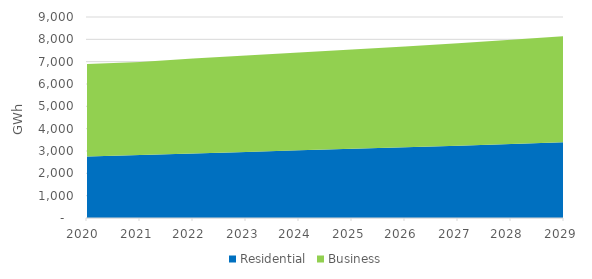
| Category | Residential | Business |
|---|---|---|
| 2020.0 | 2752.511 | 4138.821 |
| 2021.0 | 2815.562 | 4168.811 |
| 2022.0 | 2886.587 | 4251.634 |
| 2023.0 | 2956.984 | 4315.358 |
| 2024.0 | 3029.251 | 4380.176 |
| 2025.0 | 3096.515 | 4447.137 |
| 2026.0 | 3164.734 | 4519.545 |
| 2027.0 | 3234.754 | 4593.281 |
| 2028.0 | 3312.614 | 4670.951 |
| 2029.0 | 3392.484 | 4749.572 |